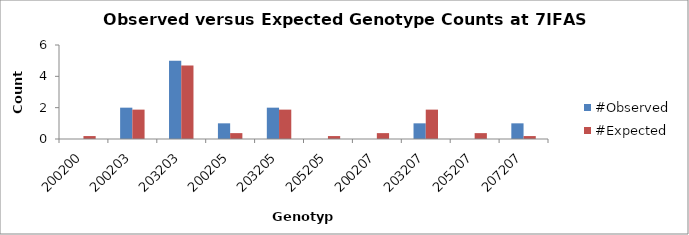
| Category | #Observed | #Expected |
|---|---|---|
| 200200.0 | 0 | 0.188 |
| 200203.0 | 2 | 1.875 |
| 203203.0 | 5 | 4.688 |
| 200205.0 | 1 | 0.375 |
| 203205.0 | 2 | 1.875 |
| 205205.0 | 0 | 0.188 |
| 200207.0 | 0 | 0.375 |
| 203207.0 | 1 | 1.875 |
| 205207.0 | 0 | 0.375 |
| 207207.0 | 1 | 0.188 |